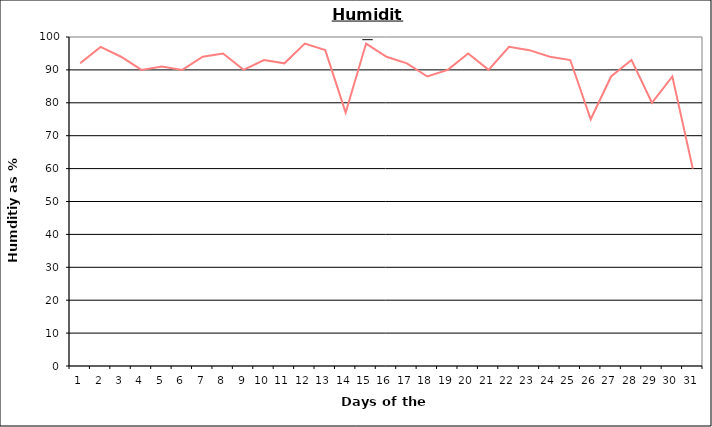
| Category | Series 0 |
|---|---|
| 0 | 92 |
| 1 | 97 |
| 2 | 94 |
| 3 | 90 |
| 4 | 91 |
| 5 | 90 |
| 6 | 94 |
| 7 | 95 |
| 8 | 90 |
| 9 | 93 |
| 10 | 92 |
| 11 | 98 |
| 12 | 96 |
| 13 | 77 |
| 14 | 98 |
| 15 | 94 |
| 16 | 92 |
| 17 | 88 |
| 18 | 90 |
| 19 | 95 |
| 20 | 90 |
| 21 | 97 |
| 22 | 96 |
| 23 | 94 |
| 24 | 93 |
| 25 | 75 |
| 26 | 88 |
| 27 | 93 |
| 28 | 80 |
| 29 | 88 |
| 30 | 60 |